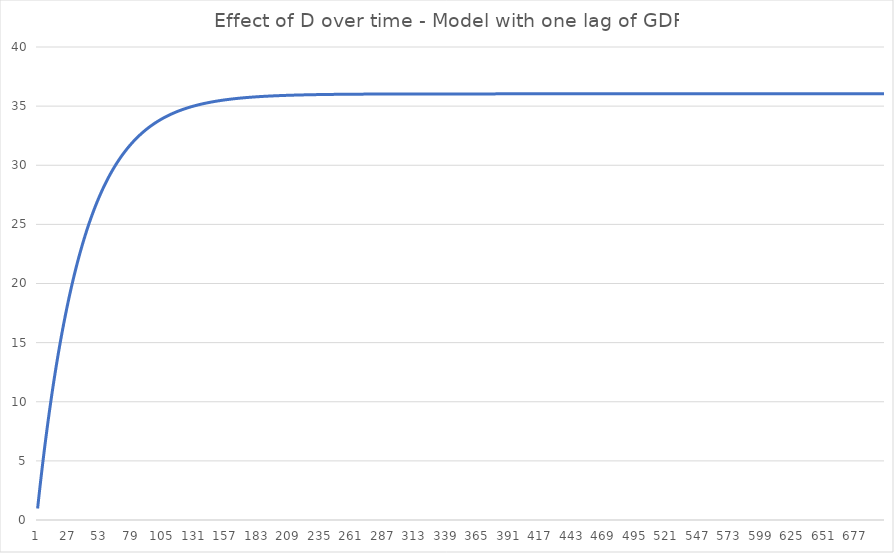
| Category | total |
|---|---|
| 0 | 0.973 |
| 1 | 1.92 |
| 2 | 2.841 |
| 3 | 3.737 |
| 4 | 4.609 |
| 5 | 5.458 |
| 6 | 6.283 |
| 7 | 7.087 |
| 8 | 7.868 |
| 9 | 8.629 |
| 10 | 9.369 |
| 11 | 10.089 |
| 12 | 10.79 |
| 13 | 11.471 |
| 14 | 12.135 |
| 15 | 12.78 |
| 16 | 13.408 |
| 17 | 14.019 |
| 18 | 14.613 |
| 19 | 15.192 |
| 20 | 15.755 |
| 21 | 16.302 |
| 22 | 16.835 |
| 23 | 17.354 |
| 24 | 17.858 |
| 25 | 18.349 |
| 26 | 18.826 |
| 27 | 19.291 |
| 28 | 19.743 |
| 29 | 20.183 |
| 30 | 20.611 |
| 31 | 21.028 |
| 32 | 21.433 |
| 33 | 21.827 |
| 34 | 22.211 |
| 35 | 22.584 |
| 36 | 22.948 |
| 37 | 23.301 |
| 38 | 23.645 |
| 39 | 23.979 |
| 40 | 24.305 |
| 41 | 24.622 |
| 42 | 24.93 |
| 43 | 25.23 |
| 44 | 25.522 |
| 45 | 25.806 |
| 46 | 26.082 |
| 47 | 26.351 |
| 48 | 26.612 |
| 49 | 26.867 |
| 50 | 27.114 |
| 51 | 27.355 |
| 52 | 27.59 |
| 53 | 27.818 |
| 54 | 28.04 |
| 55 | 28.255 |
| 56 | 28.466 |
| 57 | 28.67 |
| 58 | 28.869 |
| 59 | 29.062 |
| 60 | 29.251 |
| 61 | 29.434 |
| 62 | 29.612 |
| 63 | 29.786 |
| 64 | 29.955 |
| 65 | 30.119 |
| 66 | 30.279 |
| 67 | 30.434 |
| 68 | 30.585 |
| 69 | 30.732 |
| 70 | 30.876 |
| 71 | 31.015 |
| 72 | 31.151 |
| 73 | 31.283 |
| 74 | 31.411 |
| 75 | 31.536 |
| 76 | 31.657 |
| 77 | 31.776 |
| 78 | 31.891 |
| 79 | 32.003 |
| 80 | 32.112 |
| 81 | 32.218 |
| 82 | 32.321 |
| 83 | 32.421 |
| 84 | 32.519 |
| 85 | 32.614 |
| 86 | 32.706 |
| 87 | 32.796 |
| 88 | 32.884 |
| 89 | 32.969 |
| 90 | 33.052 |
| 91 | 33.132 |
| 92 | 33.211 |
| 93 | 33.287 |
| 94 | 33.361 |
| 95 | 33.433 |
| 96 | 33.504 |
| 97 | 33.572 |
| 98 | 33.639 |
| 99 | 33.703 |
| 100 | 33.766 |
| 101 | 33.828 |
| 102 | 33.887 |
| 103 | 33.945 |
| 104 | 34.002 |
| 105 | 34.057 |
| 106 | 34.11 |
| 107 | 34.162 |
| 108 | 34.213 |
| 109 | 34.262 |
| 110 | 34.31 |
| 111 | 34.357 |
| 112 | 34.402 |
| 113 | 34.446 |
| 114 | 34.489 |
| 115 | 34.531 |
| 116 | 34.572 |
| 117 | 34.611 |
| 118 | 34.65 |
| 119 | 34.687 |
| 120 | 34.724 |
| 121 | 34.759 |
| 122 | 34.794 |
| 123 | 34.827 |
| 124 | 34.86 |
| 125 | 34.892 |
| 126 | 34.923 |
| 127 | 34.953 |
| 128 | 34.982 |
| 129 | 35.01 |
| 130 | 35.038 |
| 131 | 35.065 |
| 132 | 35.091 |
| 133 | 35.117 |
| 134 | 35.142 |
| 135 | 35.166 |
| 136 | 35.189 |
| 137 | 35.212 |
| 138 | 35.235 |
| 139 | 35.256 |
| 140 | 35.277 |
| 141 | 35.298 |
| 142 | 35.318 |
| 143 | 35.337 |
| 144 | 35.356 |
| 145 | 35.374 |
| 146 | 35.392 |
| 147 | 35.41 |
| 148 | 35.427 |
| 149 | 35.443 |
| 150 | 35.459 |
| 151 | 35.475 |
| 152 | 35.49 |
| 153 | 35.505 |
| 154 | 35.519 |
| 155 | 35.533 |
| 156 | 35.547 |
| 157 | 35.56 |
| 158 | 35.573 |
| 159 | 35.585 |
| 160 | 35.598 |
| 161 | 35.609 |
| 162 | 35.621 |
| 163 | 35.632 |
| 164 | 35.643 |
| 165 | 35.654 |
| 166 | 35.664 |
| 167 | 35.674 |
| 168 | 35.684 |
| 169 | 35.694 |
| 170 | 35.703 |
| 171 | 35.712 |
| 172 | 35.721 |
| 173 | 35.729 |
| 174 | 35.737 |
| 175 | 35.746 |
| 176 | 35.753 |
| 177 | 35.761 |
| 178 | 35.769 |
| 179 | 35.776 |
| 180 | 35.783 |
| 181 | 35.79 |
| 182 | 35.796 |
| 183 | 35.803 |
| 184 | 35.809 |
| 185 | 35.815 |
| 186 | 35.821 |
| 187 | 35.827 |
| 188 | 35.833 |
| 189 | 35.838 |
| 190 | 35.844 |
| 191 | 35.849 |
| 192 | 35.854 |
| 193 | 35.859 |
| 194 | 35.864 |
| 195 | 35.868 |
| 196 | 35.873 |
| 197 | 35.877 |
| 198 | 35.882 |
| 199 | 35.886 |
| 200 | 35.89 |
| 201 | 35.894 |
| 202 | 35.898 |
| 203 | 35.902 |
| 204 | 35.905 |
| 205 | 35.909 |
| 206 | 35.912 |
| 207 | 35.916 |
| 208 | 35.919 |
| 209 | 35.922 |
| 210 | 35.925 |
| 211 | 35.928 |
| 212 | 35.931 |
| 213 | 35.934 |
| 214 | 35.937 |
| 215 | 35.94 |
| 216 | 35.942 |
| 217 | 35.945 |
| 218 | 35.947 |
| 219 | 35.95 |
| 220 | 35.952 |
| 221 | 35.954 |
| 222 | 35.957 |
| 223 | 35.959 |
| 224 | 35.961 |
| 225 | 35.963 |
| 226 | 35.965 |
| 227 | 35.967 |
| 228 | 35.969 |
| 229 | 35.971 |
| 230 | 35.972 |
| 231 | 35.974 |
| 232 | 35.976 |
| 233 | 35.977 |
| 234 | 35.979 |
| 235 | 35.981 |
| 236 | 35.982 |
| 237 | 35.984 |
| 238 | 35.985 |
| 239 | 35.986 |
| 240 | 35.988 |
| 241 | 35.989 |
| 242 | 35.99 |
| 243 | 35.992 |
| 244 | 35.993 |
| 245 | 35.994 |
| 246 | 35.995 |
| 247 | 35.996 |
| 248 | 35.998 |
| 249 | 35.999 |
| 250 | 36 |
| 251 | 36.001 |
| 252 | 36.002 |
| 253 | 36.003 |
| 254 | 36.004 |
| 255 | 36.004 |
| 256 | 36.005 |
| 257 | 36.006 |
| 258 | 36.007 |
| 259 | 36.008 |
| 260 | 36.009 |
| 261 | 36.009 |
| 262 | 36.01 |
| 263 | 36.011 |
| 264 | 36.012 |
| 265 | 36.012 |
| 266 | 36.013 |
| 267 | 36.014 |
| 268 | 36.014 |
| 269 | 36.015 |
| 270 | 36.015 |
| 271 | 36.016 |
| 272 | 36.017 |
| 273 | 36.017 |
| 274 | 36.018 |
| 275 | 36.018 |
| 276 | 36.019 |
| 277 | 36.019 |
| 278 | 36.02 |
| 279 | 36.02 |
| 280 | 36.021 |
| 281 | 36.021 |
| 282 | 36.021 |
| 283 | 36.022 |
| 284 | 36.022 |
| 285 | 36.023 |
| 286 | 36.023 |
| 287 | 36.023 |
| 288 | 36.024 |
| 289 | 36.024 |
| 290 | 36.025 |
| 291 | 36.025 |
| 292 | 36.025 |
| 293 | 36.026 |
| 294 | 36.026 |
| 295 | 36.026 |
| 296 | 36.026 |
| 297 | 36.027 |
| 298 | 36.027 |
| 299 | 36.027 |
| 300 | 36.028 |
| 301 | 36.028 |
| 302 | 36.028 |
| 303 | 36.028 |
| 304 | 36.029 |
| 305 | 36.029 |
| 306 | 36.029 |
| 307 | 36.029 |
| 308 | 36.029 |
| 309 | 36.03 |
| 310 | 36.03 |
| 311 | 36.03 |
| 312 | 36.03 |
| 313 | 36.03 |
| 314 | 36.031 |
| 315 | 36.031 |
| 316 | 36.031 |
| 317 | 36.031 |
| 318 | 36.031 |
| 319 | 36.031 |
| 320 | 36.032 |
| 321 | 36.032 |
| 322 | 36.032 |
| 323 | 36.032 |
| 324 | 36.032 |
| 325 | 36.032 |
| 326 | 36.032 |
| 327 | 36.032 |
| 328 | 36.033 |
| 329 | 36.033 |
| 330 | 36.033 |
| 331 | 36.033 |
| 332 | 36.033 |
| 333 | 36.033 |
| 334 | 36.033 |
| 335 | 36.033 |
| 336 | 36.033 |
| 337 | 36.034 |
| 338 | 36.034 |
| 339 | 36.034 |
| 340 | 36.034 |
| 341 | 36.034 |
| 342 | 36.034 |
| 343 | 36.034 |
| 344 | 36.034 |
| 345 | 36.034 |
| 346 | 36.034 |
| 347 | 36.034 |
| 348 | 36.034 |
| 349 | 36.035 |
| 350 | 36.035 |
| 351 | 36.035 |
| 352 | 36.035 |
| 353 | 36.035 |
| 354 | 36.035 |
| 355 | 36.035 |
| 356 | 36.035 |
| 357 | 36.035 |
| 358 | 36.035 |
| 359 | 36.035 |
| 360 | 36.035 |
| 361 | 36.035 |
| 362 | 36.035 |
| 363 | 36.035 |
| 364 | 36.035 |
| 365 | 36.035 |
| 366 | 36.035 |
| 367 | 36.036 |
| 368 | 36.036 |
| 369 | 36.036 |
| 370 | 36.036 |
| 371 | 36.036 |
| 372 | 36.036 |
| 373 | 36.036 |
| 374 | 36.036 |
| 375 | 36.036 |
| 376 | 36.036 |
| 377 | 36.036 |
| 378 | 36.036 |
| 379 | 36.036 |
| 380 | 36.036 |
| 381 | 36.036 |
| 382 | 36.036 |
| 383 | 36.036 |
| 384 | 36.036 |
| 385 | 36.036 |
| 386 | 36.036 |
| 387 | 36.036 |
| 388 | 36.036 |
| 389 | 36.036 |
| 390 | 36.036 |
| 391 | 36.036 |
| 392 | 36.036 |
| 393 | 36.036 |
| 394 | 36.036 |
| 395 | 36.036 |
| 396 | 36.036 |
| 397 | 36.036 |
| 398 | 36.036 |
| 399 | 36.036 |
| 400 | 36.036 |
| 401 | 36.036 |
| 402 | 36.036 |
| 403 | 36.036 |
| 404 | 36.036 |
| 405 | 36.036 |
| 406 | 36.037 |
| 407 | 36.037 |
| 408 | 36.037 |
| 409 | 36.037 |
| 410 | 36.037 |
| 411 | 36.037 |
| 412 | 36.037 |
| 413 | 36.037 |
| 414 | 36.037 |
| 415 | 36.037 |
| 416 | 36.037 |
| 417 | 36.037 |
| 418 | 36.037 |
| 419 | 36.037 |
| 420 | 36.037 |
| 421 | 36.037 |
| 422 | 36.037 |
| 423 | 36.037 |
| 424 | 36.037 |
| 425 | 36.037 |
| 426 | 36.037 |
| 427 | 36.037 |
| 428 | 36.037 |
| 429 | 36.037 |
| 430 | 36.037 |
| 431 | 36.037 |
| 432 | 36.037 |
| 433 | 36.037 |
| 434 | 36.037 |
| 435 | 36.037 |
| 436 | 36.037 |
| 437 | 36.037 |
| 438 | 36.037 |
| 439 | 36.037 |
| 440 | 36.037 |
| 441 | 36.037 |
| 442 | 36.037 |
| 443 | 36.037 |
| 444 | 36.037 |
| 445 | 36.037 |
| 446 | 36.037 |
| 447 | 36.037 |
| 448 | 36.037 |
| 449 | 36.037 |
| 450 | 36.037 |
| 451 | 36.037 |
| 452 | 36.037 |
| 453 | 36.037 |
| 454 | 36.037 |
| 455 | 36.037 |
| 456 | 36.037 |
| 457 | 36.037 |
| 458 | 36.037 |
| 459 | 36.037 |
| 460 | 36.037 |
| 461 | 36.037 |
| 462 | 36.037 |
| 463 | 36.037 |
| 464 | 36.037 |
| 465 | 36.037 |
| 466 | 36.037 |
| 467 | 36.037 |
| 468 | 36.037 |
| 469 | 36.037 |
| 470 | 36.037 |
| 471 | 36.037 |
| 472 | 36.037 |
| 473 | 36.037 |
| 474 | 36.037 |
| 475 | 36.037 |
| 476 | 36.037 |
| 477 | 36.037 |
| 478 | 36.037 |
| 479 | 36.037 |
| 480 | 36.037 |
| 481 | 36.037 |
| 482 | 36.037 |
| 483 | 36.037 |
| 484 | 36.037 |
| 485 | 36.037 |
| 486 | 36.037 |
| 487 | 36.037 |
| 488 | 36.037 |
| 489 | 36.037 |
| 490 | 36.037 |
| 491 | 36.037 |
| 492 | 36.037 |
| 493 | 36.037 |
| 494 | 36.037 |
| 495 | 36.037 |
| 496 | 36.037 |
| 497 | 36.037 |
| 498 | 36.037 |
| 499 | 36.037 |
| 500 | 36.037 |
| 501 | 36.037 |
| 502 | 36.037 |
| 503 | 36.037 |
| 504 | 36.037 |
| 505 | 36.037 |
| 506 | 36.037 |
| 507 | 36.037 |
| 508 | 36.037 |
| 509 | 36.037 |
| 510 | 36.037 |
| 511 | 36.037 |
| 512 | 36.037 |
| 513 | 36.037 |
| 514 | 36.037 |
| 515 | 36.037 |
| 516 | 36.037 |
| 517 | 36.037 |
| 518 | 36.037 |
| 519 | 36.037 |
| 520 | 36.037 |
| 521 | 36.037 |
| 522 | 36.037 |
| 523 | 36.037 |
| 524 | 36.037 |
| 525 | 36.037 |
| 526 | 36.037 |
| 527 | 36.037 |
| 528 | 36.037 |
| 529 | 36.037 |
| 530 | 36.037 |
| 531 | 36.037 |
| 532 | 36.037 |
| 533 | 36.037 |
| 534 | 36.037 |
| 535 | 36.037 |
| 536 | 36.037 |
| 537 | 36.037 |
| 538 | 36.037 |
| 539 | 36.037 |
| 540 | 36.037 |
| 541 | 36.037 |
| 542 | 36.037 |
| 543 | 36.037 |
| 544 | 36.037 |
| 545 | 36.037 |
| 546 | 36.037 |
| 547 | 36.037 |
| 548 | 36.037 |
| 549 | 36.037 |
| 550 | 36.037 |
| 551 | 36.037 |
| 552 | 36.037 |
| 553 | 36.037 |
| 554 | 36.037 |
| 555 | 36.037 |
| 556 | 36.037 |
| 557 | 36.037 |
| 558 | 36.037 |
| 559 | 36.037 |
| 560 | 36.037 |
| 561 | 36.037 |
| 562 | 36.037 |
| 563 | 36.037 |
| 564 | 36.037 |
| 565 | 36.037 |
| 566 | 36.037 |
| 567 | 36.037 |
| 568 | 36.037 |
| 569 | 36.037 |
| 570 | 36.037 |
| 571 | 36.037 |
| 572 | 36.037 |
| 573 | 36.037 |
| 574 | 36.037 |
| 575 | 36.037 |
| 576 | 36.037 |
| 577 | 36.037 |
| 578 | 36.037 |
| 579 | 36.037 |
| 580 | 36.037 |
| 581 | 36.037 |
| 582 | 36.037 |
| 583 | 36.037 |
| 584 | 36.037 |
| 585 | 36.037 |
| 586 | 36.037 |
| 587 | 36.037 |
| 588 | 36.037 |
| 589 | 36.037 |
| 590 | 36.037 |
| 591 | 36.037 |
| 592 | 36.037 |
| 593 | 36.037 |
| 594 | 36.037 |
| 595 | 36.037 |
| 596 | 36.037 |
| 597 | 36.037 |
| 598 | 36.037 |
| 599 | 36.037 |
| 600 | 36.037 |
| 601 | 36.037 |
| 602 | 36.037 |
| 603 | 36.037 |
| 604 | 36.037 |
| 605 | 36.037 |
| 606 | 36.037 |
| 607 | 36.037 |
| 608 | 36.037 |
| 609 | 36.037 |
| 610 | 36.037 |
| 611 | 36.037 |
| 612 | 36.037 |
| 613 | 36.037 |
| 614 | 36.037 |
| 615 | 36.037 |
| 616 | 36.037 |
| 617 | 36.037 |
| 618 | 36.037 |
| 619 | 36.037 |
| 620 | 36.037 |
| 621 | 36.037 |
| 622 | 36.037 |
| 623 | 36.037 |
| 624 | 36.037 |
| 625 | 36.037 |
| 626 | 36.037 |
| 627 | 36.037 |
| 628 | 36.037 |
| 629 | 36.037 |
| 630 | 36.037 |
| 631 | 36.037 |
| 632 | 36.037 |
| 633 | 36.037 |
| 634 | 36.037 |
| 635 | 36.037 |
| 636 | 36.037 |
| 637 | 36.037 |
| 638 | 36.037 |
| 639 | 36.037 |
| 640 | 36.037 |
| 641 | 36.037 |
| 642 | 36.037 |
| 643 | 36.037 |
| 644 | 36.037 |
| 645 | 36.037 |
| 646 | 36.037 |
| 647 | 36.037 |
| 648 | 36.037 |
| 649 | 36.037 |
| 650 | 36.037 |
| 651 | 36.037 |
| 652 | 36.037 |
| 653 | 36.037 |
| 654 | 36.037 |
| 655 | 36.037 |
| 656 | 36.037 |
| 657 | 36.037 |
| 658 | 36.037 |
| 659 | 36.037 |
| 660 | 36.037 |
| 661 | 36.037 |
| 662 | 36.037 |
| 663 | 36.037 |
| 664 | 36.037 |
| 665 | 36.037 |
| 666 | 36.037 |
| 667 | 36.037 |
| 668 | 36.037 |
| 669 | 36.037 |
| 670 | 36.037 |
| 671 | 36.037 |
| 672 | 36.037 |
| 673 | 36.037 |
| 674 | 36.037 |
| 675 | 36.037 |
| 676 | 36.037 |
| 677 | 36.037 |
| 678 | 36.037 |
| 679 | 36.037 |
| 680 | 36.037 |
| 681 | 36.037 |
| 682 | 36.037 |
| 683 | 36.037 |
| 684 | 36.037 |
| 685 | 36.037 |
| 686 | 36.037 |
| 687 | 36.037 |
| 688 | 36.037 |
| 689 | 36.037 |
| 690 | 36.037 |
| 691 | 36.037 |
| 692 | 36.037 |
| 693 | 36.037 |
| 694 | 36.037 |
| 695 | 36.037 |
| 696 | 36.037 |
| 697 | 36.037 |
| 698 | 36.037 |
| 699 | 36.037 |